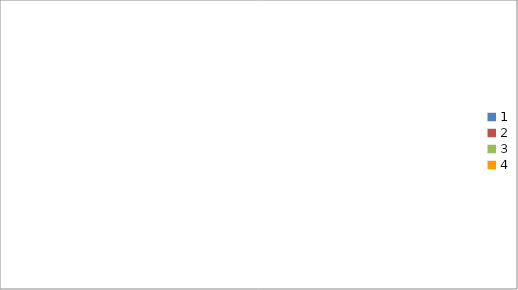
| Category | Series 0 |
|---|---|
| 0 | 1470 |
| 1 | 2440 |
| 2 | 3390 |
| 3 | 790 |